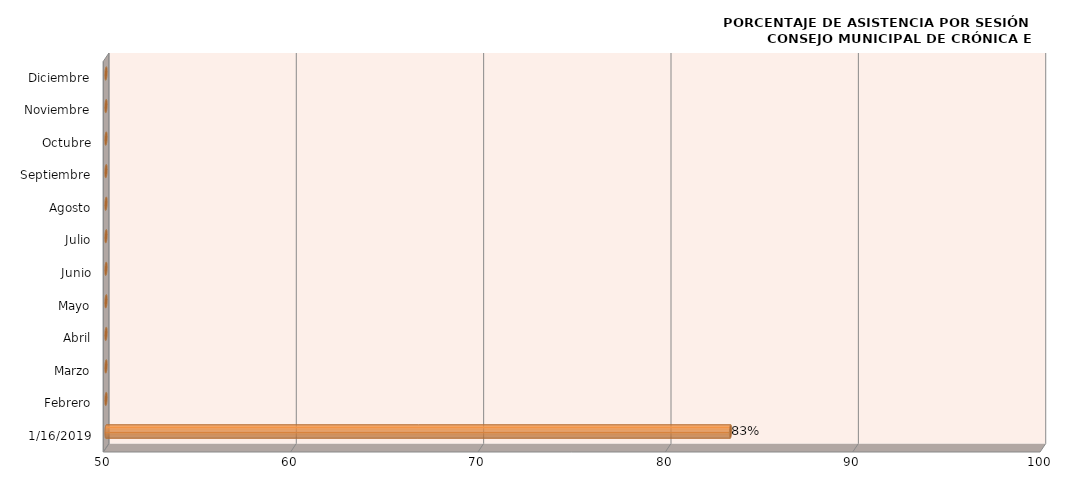
| Category | Series 0 |
|---|---|
| 16/01/2019 | 83.333 |
| Febrero | 0 |
| Marzo | 0 |
| Abril | 0 |
| Mayo | 0 |
| Junio | 0 |
| Julio | 0 |
| Agosto | 0 |
| Septiembre | 0 |
| Octubre | 0 |
| Noviembre | 0 |
| Diciembre | 0 |